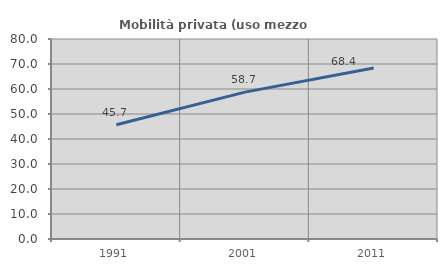
| Category | Mobilità privata (uso mezzo privato) |
|---|---|
| 1991.0 | 45.709 |
| 2001.0 | 58.749 |
| 2011.0 | 68.365 |